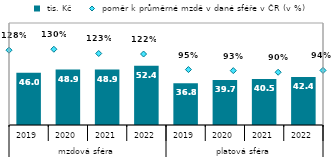
| Category |  tis. Kč |
|---|---|
| 0 | 45.999 |
| 1 | 48.906 |
| 2 | 48.923 |
| 3 | 52.368 |
| 4 | 36.802 |
| 5 | 39.692 |
| 6 | 40.527 |
| 7 | 42.379 |